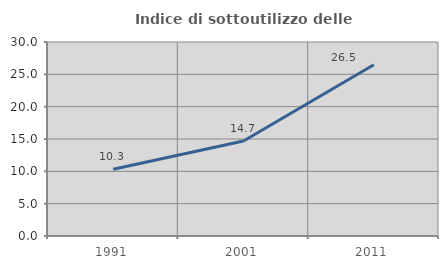
| Category | Indice di sottoutilizzo delle abitazioni  |
|---|---|
| 1991.0 | 10.314 |
| 2001.0 | 14.689 |
| 2011.0 | 26.471 |